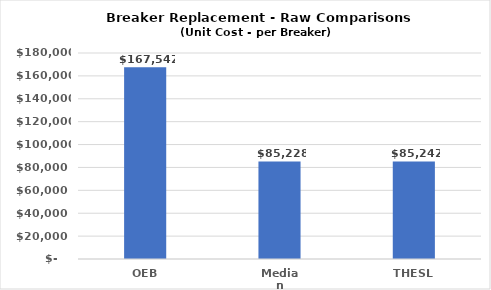
| Category | Series 0 |
|---|---|
| OEB | 167542 |
| Median | 85228.143 |
| THESL | 85242 |